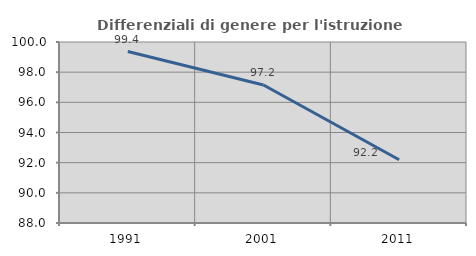
| Category | Differenziali di genere per l'istruzione superiore |
|---|---|
| 1991.0 | 99.366 |
| 2001.0 | 97.152 |
| 2011.0 | 92.196 |